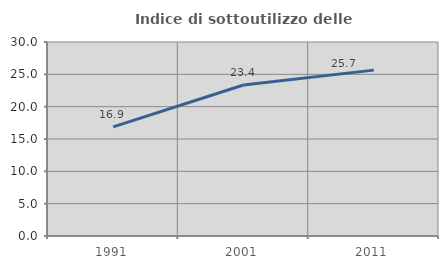
| Category | Indice di sottoutilizzo delle abitazioni  |
|---|---|
| 1991.0 | 16.867 |
| 2001.0 | 23.353 |
| 2011.0 | 25.652 |